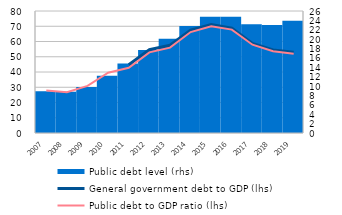
| Category | Public debt level (rhs) |
|---|---|
| 2007 | 8.9 |
| 2008 | 8.8 |
| 2009 | 9.8 |
| 2010 | 12.2 |
| 2011 | 14.8 |
| 2012 | 17.7 |
| 2013 | 20.1 |
| 2014 | 22.8 |
| 2015 | 24.8 |
| 2016 | 24.8 |
| 2017 | 23.2 |
| 2018 | 23.015 |